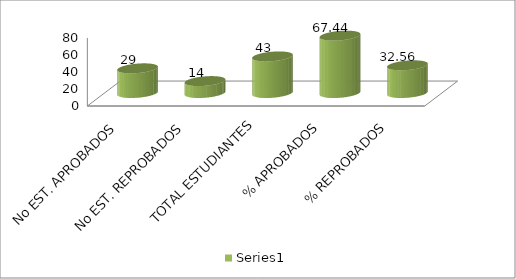
| Category | Series 0 |
|---|---|
| No EST. APROBADOS | 29 |
| No EST. REPROBADOS | 14 |
| TOTAL ESTUDIANTES | 43 |
| % APROBADOS | 67.442 |
| % REPROBADOS | 32.558 |